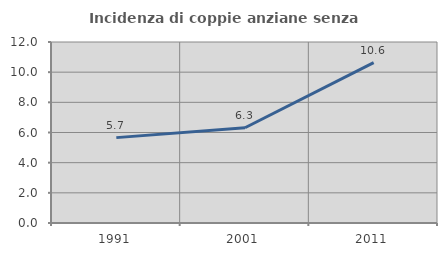
| Category | Incidenza di coppie anziane senza figli  |
|---|---|
| 1991.0 | 5.66 |
| 2001.0 | 6.316 |
| 2011.0 | 10.638 |